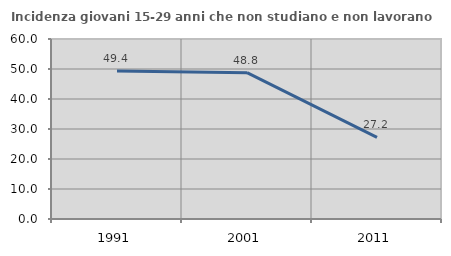
| Category | Incidenza giovani 15-29 anni che non studiano e non lavorano  |
|---|---|
| 1991.0 | 49.372 |
| 2001.0 | 48.78 |
| 2011.0 | 27.179 |